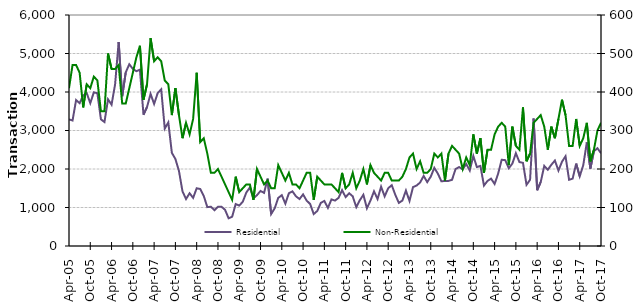
| Category | Residential |
|---|---|
| 2005-04-01 | 3290 |
| 2005-05-01 | 3260 |
| 2005-06-01 | 3790 |
| 2005-07-01 | 3710 |
| 2005-08-01 | 3910 |
| 2005-09-01 | 3970 |
| 2005-10-01 | 3710 |
| 2005-11-01 | 3990 |
| 2005-12-01 | 3970 |
| 2006-01-01 | 3290 |
| 2006-02-01 | 3220 |
| 2006-03-01 | 3810 |
| 2006-04-01 | 3670 |
| 2006-05-01 | 4200 |
| 2006-06-01 | 5300 |
| 2006-07-01 | 3890 |
| 2006-08-01 | 4510 |
| 2006-09-01 | 4720 |
| 2006-10-01 | 4600 |
| 2006-11-01 | 4540 |
| 2006-12-01 | 4580 |
| 2007-01-01 | 3410 |
| 2007-02-01 | 3610 |
| 2007-03-01 | 3950 |
| 2007-04-01 | 3690 |
| 2007-05-01 | 3970 |
| 2007-06-01 | 4070 |
| 2007-07-01 | 3050 |
| 2007-08-01 | 3210 |
| 2007-09-01 | 2420 |
| 2007-10-01 | 2260 |
| 2007-11-01 | 1950 |
| 2007-12-01 | 1420 |
| 2008-01-01 | 1220 |
| 2008-02-01 | 1370 |
| 2008-03-01 | 1250 |
| 2008-04-01 | 1500 |
| 2008-05-01 | 1480 |
| 2008-06-01 | 1300 |
| 2008-07-01 | 1010 |
| 2008-08-01 | 1020 |
| 2008-09-01 | 930 |
| 2008-10-01 | 1020 |
| 2008-11-01 | 1020 |
| 2008-12-01 | 940 |
| 2009-01-01 | 720 |
| 2009-02-01 | 760 |
| 2009-03-01 | 1090 |
| 2009-04-01 | 1050 |
| 2009-05-01 | 1150 |
| 2009-06-01 | 1390 |
| 2009-07-01 | 1520 |
| 2009-08-01 | 1240 |
| 2009-09-01 | 1320 |
| 2009-10-01 | 1430 |
| 2009-11-01 | 1380 |
| 2009-12-01 | 1750 |
| 2010-01-01 | 830 |
| 2010-02-01 | 980 |
| 2010-03-01 | 1250 |
| 2010-04-01 | 1320 |
| 2010-05-01 | 1100 |
| 2010-06-01 | 1370 |
| 2010-07-01 | 1420 |
| 2010-08-01 | 1290 |
| 2010-09-01 | 1220 |
| 2010-10-01 | 1340 |
| 2010-11-01 | 1180 |
| 2010-12-01 | 1090 |
| 2011-01-01 | 830 |
| 2011-02-01 | 910 |
| 2011-03-01 | 1120 |
| 2011-04-01 | 1170 |
| 2011-05-01 | 990 |
| 2011-06-01 | 1210 |
| 2011-07-01 | 1180 |
| 2011-08-01 | 1250 |
| 2011-09-01 | 1450 |
| 2011-10-01 | 1270 |
| 2011-11-01 | 1370 |
| 2011-12-01 | 1290 |
| 2012-01-01 | 1010 |
| 2012-02-01 | 1190 |
| 2012-03-01 | 1330 |
| 2012-04-01 | 980 |
| 2012-05-01 | 1180 |
| 2012-06-01 | 1420 |
| 2012-07-01 | 1220 |
| 2012-08-01 | 1540 |
| 2012-09-01 | 1290 |
| 2012-10-01 | 1500 |
| 2012-11-01 | 1580 |
| 2012-12-01 | 1330 |
| 2013-01-01 | 1120 |
| 2013-02-01 | 1180 |
| 2013-03-01 | 1440 |
| 2013-04-01 | 1170 |
| 2013-05-01 | 1530 |
| 2013-06-01 | 1570 |
| 2013-07-01 | 1650 |
| 2013-08-01 | 1820 |
| 2013-09-01 | 1660 |
| 2013-10-01 | 1800 |
| 2013-11-01 | 2030 |
| 2013-12-01 | 1880 |
| 2014-01-01 | 1680 |
| 2014-02-01 | 1690 |
| 2014-03-01 | 1690 |
| 2014-04-01 | 1720 |
| 2014-05-01 | 2000 |
| 2014-06-01 | 2050 |
| 2014-07-01 | 1990 |
| 2014-08-01 | 2130 |
| 2014-09-01 | 1960 |
| 2014-10-01 | 2340 |
| 2014-11-01 | 2050 |
| 2014-12-01 | 2080 |
| 2015-01-01 | 1570 |
| 2015-02-01 | 1690 |
| 2015-03-01 | 1750 |
| 2015-04-01 | 1610 |
| 2015-05-01 | 1880 |
| 2015-06-01 | 2240 |
| 2015-07-01 | 2230 |
| 2015-08-01 | 2020 |
| 2015-09-01 | 2140 |
| 2015-10-01 | 2410 |
| 2015-11-01 | 2180 |
| 2015-12-01 | 2160 |
| 2016-01-01 | 1590 |
| 2016-02-01 | 1720 |
| 2016-03-01 | 3310 |
| 2016-04-01 | 1450 |
| 2016-05-01 | 1660 |
| 2016-06-01 | 2080 |
| 2016-07-01 | 1980 |
| 2016-08-01 | 2110 |
| 2016-09-01 | 2220 |
| 2016-10-01 | 1960 |
| 2016-11-01 | 2190 |
| 2016-12-01 | 2330 |
| 2017-01-01 | 1720 |
| 2017-02-01 | 1750 |
| 2017-03-01 | 2140 |
| 2017-04-01 | 1810 |
| 2017-05-01 | 2100 |
| 2017-06-01 | 2690 |
| 2017-07-01 | 2010 |
| 2017-08-01 | 2460 |
| 2017-09-01 | 2540 |
| 2017-10-01 | 2410 |